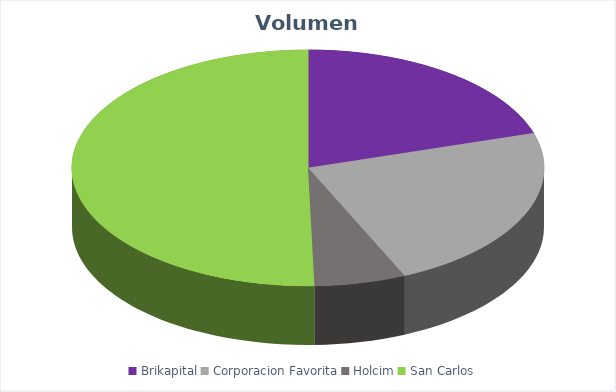
| Category | VOLUMEN ($USD) |
|---|---|
| Brikapital | 40000 |
| Corporacion Favorita | 45626.23 |
| Holcim | 12390 |
| San Carlos | 99724.8 |